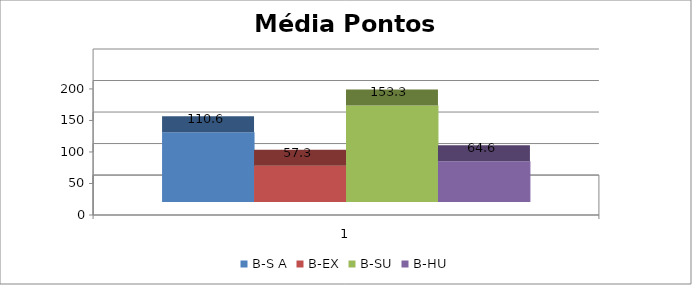
| Category | B-S A | B-EX | B-SU | B-HU |
|---|---|---|---|---|
| 0 | 110.645 | 57.348 | 153.255 | 64.571 |